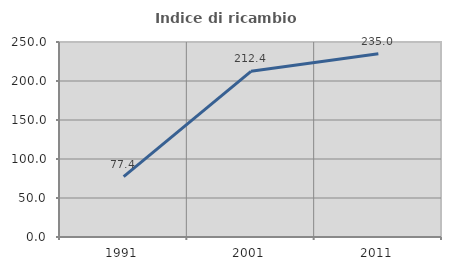
| Category | Indice di ricambio occupazionale  |
|---|---|
| 1991.0 | 77.397 |
| 2001.0 | 212.36 |
| 2011.0 | 234.959 |